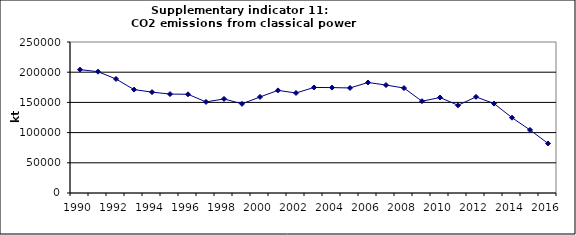
| Category | CO2 emissions from classical power production, kt |
|---|---|
| 1990 | 204254.791 |
| 1991 | 200858.311 |
| 1992 | 188753.65 |
| 1993 | 171226.101 |
| 1994 | 167030.746 |
| 1995 | 163783.274 |
| 1996 | 163460.29 |
| 1997 | 150769.954 |
| 1998 | 155749.503 |
| 1999 | 147653.881 |
| 2000 | 159007.638 |
| 2001 | 169889.865 |
| 2002 | 165587.886 |
| 2003 | 174768.935 |
| 2004 | 174529.975 |
| 2005 | 173913.516 |
| 2006 | 182972.189 |
| 2007 | 178771.956 |
| 2008 | 173741.052 |
| 2009 | 151959.408 |
| 2010 | 158061.841 |
| 2011 | 145206.403 |
| 2012 | 159083.913 |
| 2013 | 148065.721 |
| 2014 | 124683.617 |
| 2015 | 104361.701 |
| 2016 | 82007.974 |